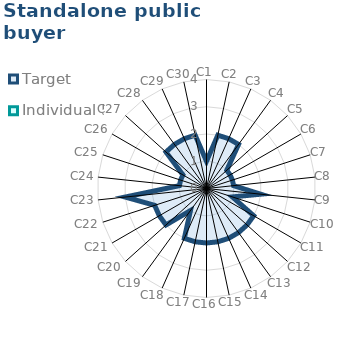
| Category | Target | Individual 5 |
|---|---|---|
| C1 | 1 | 0 |
| C2 | 2 | 0 |
| C3 | 2 | 0 |
| C4 | 2 | 0 |
| C5 | 1 | 0 |
| C6 | 1 | 0 |
| C7 | 1 | 0 |
| C8 | 1 | 0 |
| C9 | 2 | 0 |
| C10 | 1 | 0 |
| C11 | 2 | 0 |
| C12 | 2 | 0 |
| C13 | 2 | 0 |
| C14 | 2 | 0 |
| C15 | 2 | 0 |
| C16 | 2 | 0 |
| C17 | 2 | 0 |
| C18 | 2 | 0 |
| C19 | 1 | 0 |
| C20 | 2 | 0 |
| C21 | 2 | 0 |
| C22 | 2 | 0 |
| C23 | 3 | 0 |
| C24 | 1 | 0 |
| C25 | 1 | 0 |
| C26 | 1 | 0 |
| C27 | 2 | 0 |
| C28 | 2 | 0 |
| C29 | 2 | 0 |
| C30 | 2 | 0 |